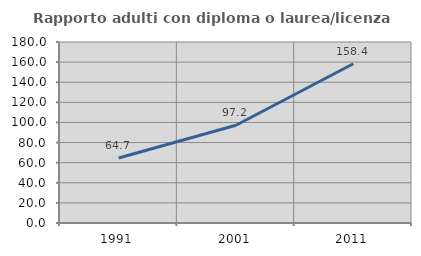
| Category | Rapporto adulti con diploma o laurea/licenza media  |
|---|---|
| 1991.0 | 64.691 |
| 2001.0 | 97.18 |
| 2011.0 | 158.381 |